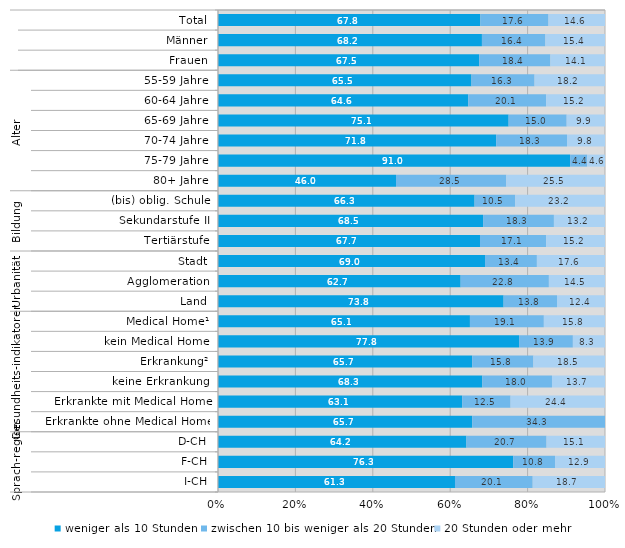
| Category | weniger als 10 Stunden | zwischen 10 bis weniger als 20 Stunden | 20 Stunden oder mehr |
|---|---|---|---|
| 0 | 67.8 | 17.6 | 14.6 |
| 1 | 68.2 | 16.4 | 15.4 |
| 2 | 67.5 | 18.4 | 14.1 |
| 3 | 65.5 | 16.3 | 18.2 |
| 4 | 64.6 | 20.1 | 15.2 |
| 5 | 75.1 | 15 | 9.9 |
| 6 | 71.8 | 18.3 | 9.8 |
| 7 | 91 | 4.4 | 4.6 |
| 8 | 46 | 28.5 | 25.5 |
| 9 | 66.3 | 10.5 | 23.2 |
| 10 | 68.5 | 18.3 | 13.2 |
| 11 | 67.7 | 17.1 | 15.2 |
| 12 | 69 | 13.4 | 17.6 |
| 13 | 62.7 | 22.8 | 14.5 |
| 14 | 73.8 | 13.8 | 12.4 |
| 15 | 65.1 | 19.1 | 15.8 |
| 16 | 77.8 | 13.9 | 8.3 |
| 17 | 65.7 | 15.8 | 18.5 |
| 18 | 68.3 | 18 | 13.7 |
| 19 | 63.1 | 12.5 | 24.4 |
| 20 | 65.7 | 34.3 | 0 |
| 21 | 64.2 | 20.7 | 15.1 |
| 22 | 76.3 | 10.8 | 12.9 |
| 23 | 61.3 | 20.1 | 18.7 |